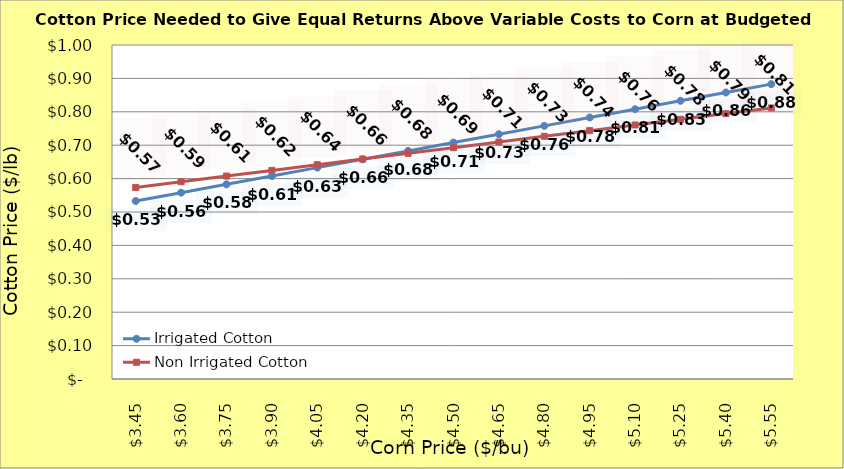
| Category | Irrigated Cotton | Non Irrigated Cotton |
|---|---|---|
| 3.4499999999999993 | 0.533 | 0.574 |
| 3.599999999999999 | 0.558 | 0.591 |
| 3.749999999999999 | 0.583 | 0.608 |
| 3.899999999999999 | 0.608 | 0.625 |
| 4.049999999999999 | 0.633 | 0.642 |
| 4.199999999999999 | 0.658 | 0.659 |
| 4.35 | 0.683 | 0.676 |
| 4.5 | 0.708 | 0.693 |
| 4.65 | 0.733 | 0.71 |
| 4.800000000000001 | 0.758 | 0.727 |
| 4.950000000000001 | 0.783 | 0.744 |
| 5.100000000000001 | 0.808 | 0.761 |
| 5.250000000000002 | 0.833 | 0.778 |
| 5.400000000000002 | 0.858 | 0.795 |
| 5.5500000000000025 | 0.883 | 0.812 |